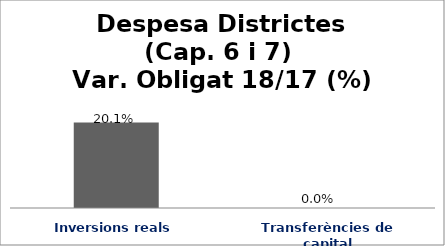
| Category | Series 0 |
|---|---|
| Inversions reals | 0.201 |
| Transferències de capital | 0 |